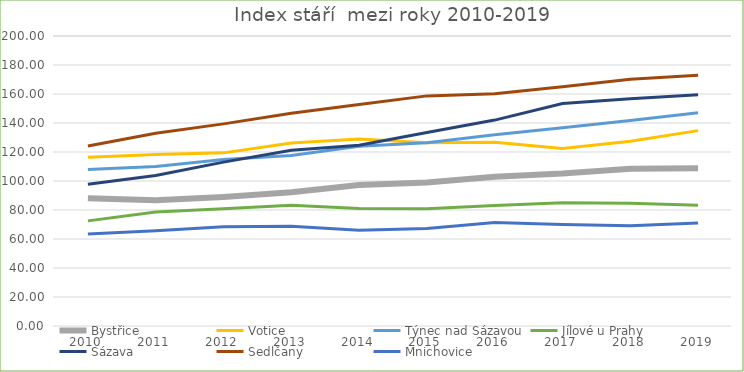
| Category | Bystřice | Votice | Týnec nad Sázavou | Jílové u Prahy | Sázava | Sedlčany | Mnichovice |
|---|---|---|---|---|---|---|---|
| 2010 | 88.138 | 116.306 | 108 | 72.5 | 97.8 | 124.2 | 63.477 |
| 2011 | 86.676 | 118.283 | 109.921 | 78.6 | 103.8 | 132.9 | 65.697 |
| 2012 | 89.013 | 119.403 | 114.86 | 80.8 | 113 | 139.4 | 68.467 |
| 2013 | 92.318 | 126.194 | 117.641 | 83.2 | 121.2 | 146.7 | 68.768 |
| 2014 | 97.294 | 128.901 | 123.894 | 81.1 | 124.6 | 152.7 | 66.062 |
| 2015 | 98.919 | 126.428 | 126.327 | 80.8 | 133.4 | 158.7 | 67.296 |
| 2016 | 102.853 | 126.649 | 131.853 | 83.1 | 142 | 160.1 | 71.429 |
| 2017 | 105.128 | 122.475 | 136.688 | 85 | 153.5 | 165 | 69.965 |
| 2018 | 108.447 | 127.487 | 141.765 | 84.6 | 156.7 | 170.1 | 69.145 |
| 2019 | 108.713 | 134.73 | 147.009 | 83.2 | 159.5 | 172.9 | 71.114 |